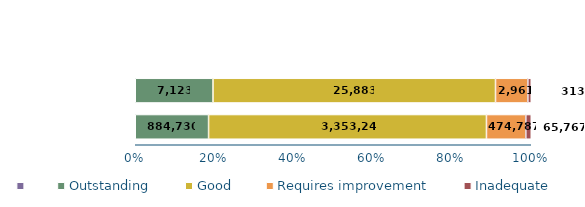
| Category | Series 1 | Outstanding | Good | Requires improvement | Inadequate |
|---|---|---|---|---|---|
| Existing places | 0 | 884730 | 3353249 | 474787 | 65767 |
| New places | 0 | 7123 | 25883 | 2961 | 313 |
| Existing places | 0 | 0 | 0 | 0 | 0 |
| New places | 0 | 0 | 0 | 0 | 0 |